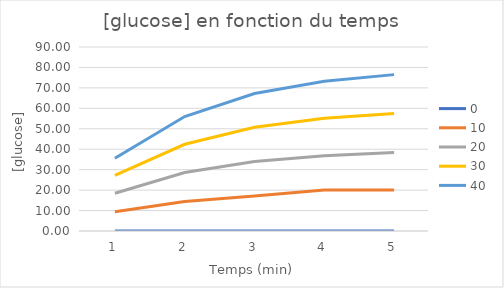
| Category | 0 | 10 | 20 | 30 | 40 |
|---|---|---|---|---|---|
| 1.0 | 0 | 9.412 | 18.462 | 27.17 | 35.556 |
| 2.0 | 0 | 14.441 | 28.582 | 42.427 | 55.981 |
| 3.0 | 0 | 17.094 | 34.001 | 50.717 | 67.24 |
| 4.0 | 0 | 20 | 36.863 | 55.132 | 73.287 |
| 5.0 | 0 | 20 | 38.364 | 57.457 | 76.488 |